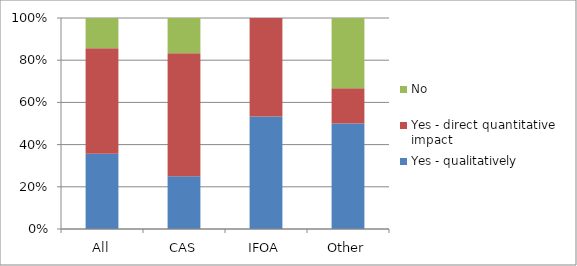
| Category | Yes - qualitatively | Yes - direct quantitative impact | No |
|---|---|---|---|
| All | 0.357 | 0.5 | 0.143 |
| CAS | 0.25 | 0.583 | 0.167 |
| IFOA | 0.533 | 0.467 | 0 |
| Other | 0.5 | 0.167 | 0.333 |